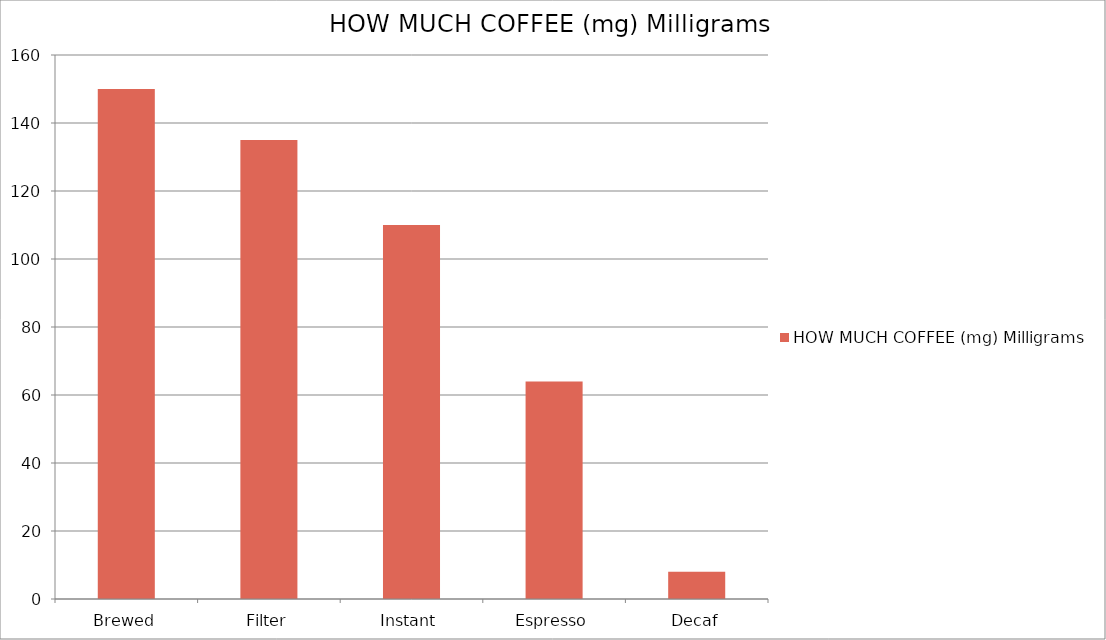
| Category | HOW MUCH COFFEE (mg) Milligrams |
|---|---|
| Brewed | 150 |
| Filter | 135 |
| Instant | 110 |
| Espresso | 64 |
| Decaf | 8 |